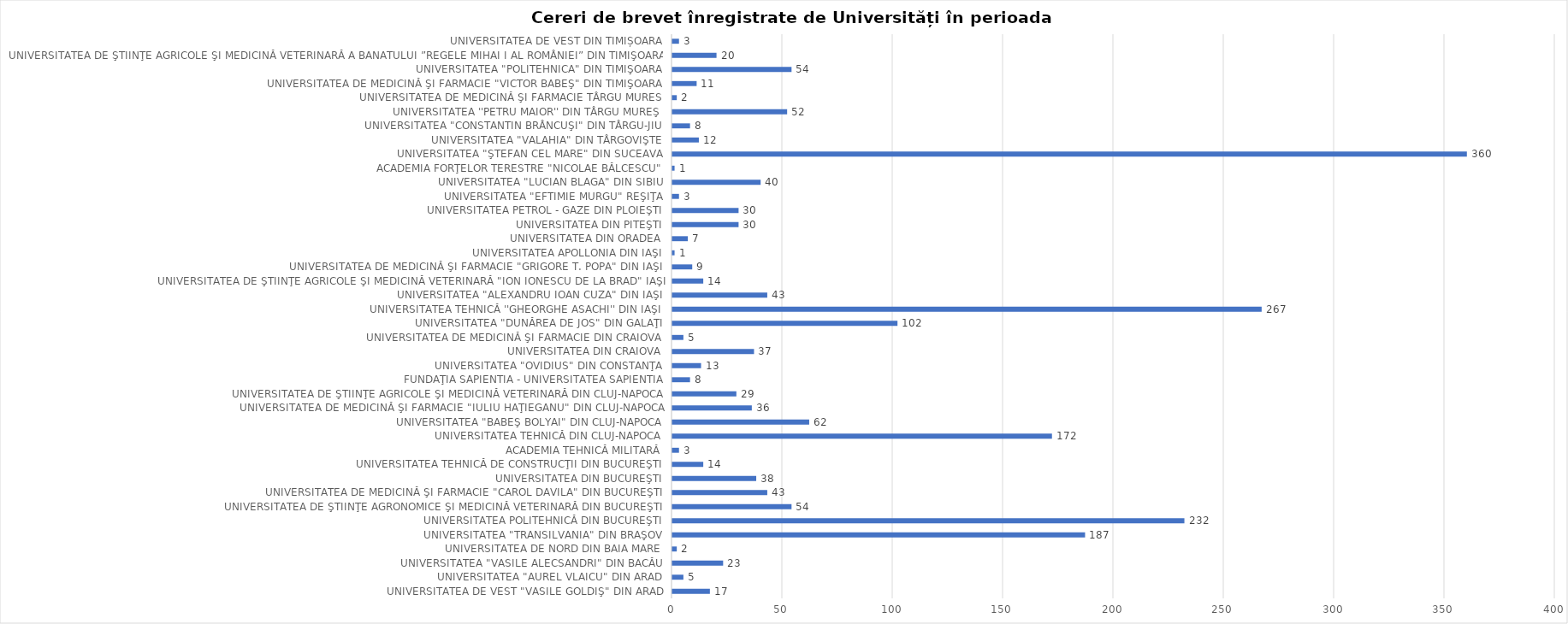
| Category | Series 0 |
|---|---|
| UNIVERSITATEA DE VEST "VASILE GOLDIŞ" DIN ARAD | 17 |
| UNIVERSITATEA "AUREL VLAICU" DIN ARAD | 5 |
| UNIVERSITATEA "VASILE ALECSANDRI" DIN BACĂU | 23 |
| UNIVERSITATEA DE NORD DIN BAIA MARE | 2 |
| UNIVERSITATEA "TRANSILVANIA" DIN BRAŞOV | 187 |
| UNIVERSITATEA POLITEHNICĂ DIN BUCUREŞTI | 232 |
| UNIVERSITATEA DE ŞTIINŢE AGRONOMICE ŞI MEDICINĂ VETERINARĂ DIN BUCUREŞTI | 54 |
| UNIVERSITATEA DE MEDICINĂ ŞI FARMACIE "CAROL DAVILA" DIN BUCUREŞTI | 43 |
| UNIVERSITATEA DIN BUCUREŞTI | 38 |
| UNIVERSITATEA TEHNICĂ DE CONSTRUCŢII DIN BUCUREŞTI | 14 |
| ACADEMIA TEHNICĂ MILITARĂ | 3 |
| UNIVERSITATEA TEHNICĂ DIN CLUJ-NAPOCA | 172 |
| UNIVERSITATEA "BABEŞ BOLYAI" DIN CLUJ-NAPOCA | 62 |
| UNIVERSITATEA DE MEDICINĂ ŞI FARMACIE "IULIU HAŢIEGANU" DIN CLUJ-NAPOCA | 36 |
| UNIVERSITATEA DE ŞTIINŢE AGRICOLE ŞI MEDICINĂ VETERINARĂ DIN CLUJ-NAPOCA | 29 |
| FUNDAŢIA SAPIENTIA - UNIVERSITATEA SAPIENTIA | 8 |
| UNIVERSITATEA "OVIDIUS" DIN CONSTANŢA | 13 |
| UNIVERSITATEA DIN CRAIOVA | 37 |
| UNIVERSITATEA DE MEDICINĂ ŞI FARMACIE DIN CRAIOVA | 5 |
| UNIVERSITATEA "DUNĂREA DE JOS" DIN GALAŢI | 102 |
| UNIVERSITATEA TEHNICĂ ''GHEORGHE ASACHI'' DIN IAŞI | 267 |
| UNIVERSITATEA "ALEXANDRU IOAN CUZA" DIN IAŞI | 43 |
| UNIVERSITATEA DE ŞTIINŢE AGRICOLE ŞI MEDICINĂ VETERINARĂ "ION IONESCU DE LA BRAD" IAŞI | 14 |
| UNIVERSITATEA DE MEDICINĂ ŞI FARMACIE "GRIGORE T. POPA" DIN IAŞI | 9 |
| UNIVERSITATEA APOLLONIA DIN IAŞI | 1 |
| UNIVERSITATEA DIN ORADEA | 7 |
| UNIVERSITATEA DIN PITEŞTI | 30 |
| UNIVERSITATEA PETROL - GAZE DIN PLOIEŞTI | 30 |
| UNIVERSITATEA "EFTIMIE MURGU" REŞIŢA | 3 |
| UNIVERSITATEA "LUCIAN BLAGA" DIN SIBIU | 40 |
| ACADEMIA FORŢELOR TERESTRE "NICOLAE BĂLCESCU" | 1 |
| UNIVERSITATEA "ŞTEFAN CEL MARE" DIN SUCEAVA | 360 |
| UNIVERSITATEA "VALAHIA" DIN TÂRGOVIŞTE | 12 |
| UNIVERSITATEA "CONSTANTIN BRÂNCUŞI" DIN TÂRGU-JIU | 8 |
| UNIVERSITATEA ''PETRU MAIOR'' DIN TÂRGU MUREŞ | 52 |
| UNIVERSITATEA DE MEDICINĂ ŞI FARMACIE TÂRGU MURES | 2 |
| UNIVERSITATEA DE MEDICINĂ ŞI FARMACIE "VICTOR BABEŞ" DIN TIMIŞOARA | 11 |
| UNIVERSITATEA "POLITEHNICA" DIN TIMIŞOARA | 54 |
| UNIVERSITATEA DE ŞTIINŢE AGRICOLE ŞI MEDICINĂ VETERINARĂ A BANATULUI ”REGELE MIHAI I AL ROMÂNIEI” DIN TIMIŞOARA | 20 |
| UNIVERSITATEA DE VEST DIN TIMIȘOARA | 3 |